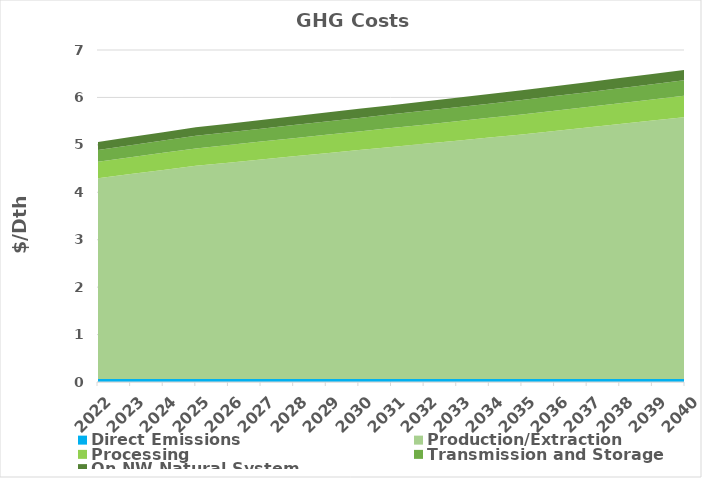
| Category | Direct Emissions | Production/Extraction | Processing | Transmission and Storage | On NW Natural System |
|---|---|---|---|---|---|
| 2022.0 | 0.063 | 4.235 | 0.346 | 0.249 | 0.168 |
| 2023.0 | 0.063 | 4.322 | 0.353 | 0.255 | 0.171 |
| 2024.0 | 0.063 | 4.409 | 0.36 | 0.26 | 0.175 |
| 2025.0 | 0.063 | 4.496 | 0.367 | 0.265 | 0.178 |
| 2026.0 | 0.063 | 4.562 | 0.372 | 0.269 | 0.181 |
| 2027.0 | 0.063 | 4.628 | 0.378 | 0.273 | 0.183 |
| 2028.0 | 0.063 | 4.694 | 0.383 | 0.277 | 0.186 |
| 2029.0 | 0.063 | 4.76 | 0.388 | 0.28 | 0.189 |
| 2030.0 | 0.063 | 4.826 | 0.394 | 0.284 | 0.191 |
| 2031.0 | 0.063 | 4.892 | 0.399 | 0.288 | 0.194 |
| 2032.0 | 0.063 | 4.958 | 0.405 | 0.292 | 0.197 |
| 2033.0 | 0.063 | 5.025 | 0.41 | 0.296 | 0.199 |
| 2034.0 | 0.063 | 5.091 | 0.415 | 0.3 | 0.202 |
| 2035.0 | 0.063 | 5.157 | 0.421 | 0.304 | 0.204 |
| 2036.0 | 0.063 | 5.23 | 0.427 | 0.308 | 0.207 |
| 2037.0 | 0.063 | 5.303 | 0.433 | 0.312 | 0.21 |
| 2038.0 | 0.063 | 5.376 | 0.439 | 0.317 | 0.213 |
| 2039.0 | 0.063 | 5.45 | 0.445 | 0.321 | 0.216 |
| 2040.0 | 0.063 | 5.523 | 0.451 | 0.325 | 0.219 |